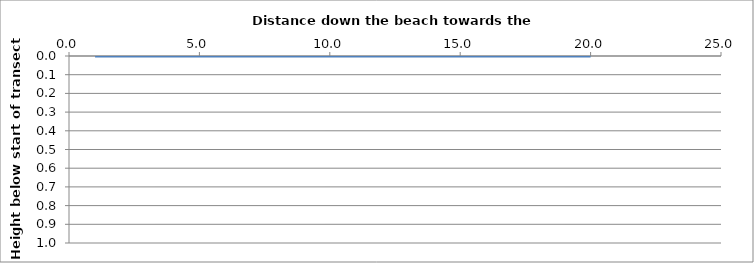
| Category | Series 0 |
|---|---|
| 0.0 | 0 |
| 0.0 | 0 |
| 0.0 | 0 |
| 0.0 | 0 |
| 0.0 | 0 |
| 0.0 | 0 |
| 0.0 | 0 |
| 0.0 | 0 |
| 0.0 | 0 |
| 0.0 | 0 |
| 0.0 | 0 |
| 0.0 | 0 |
| 0.0 | 0 |
| 0.0 | 0 |
| 0.0 | 0 |
| 0.0 | 0 |
| 0.0 | 0 |
| 0.0 | 0 |
| 0.0 | 0 |
| 0.0 | 0 |